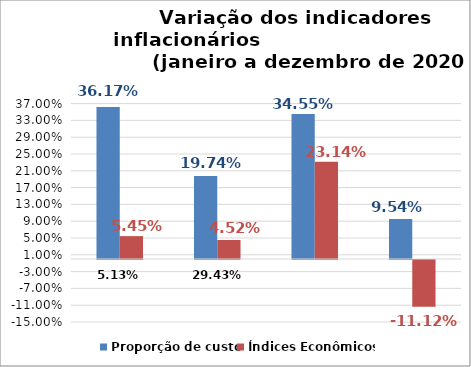
| Category | Proporção de custo | Índices Econômicos |
|---|---|---|
| 0.05126080989557842 | 0.362 | 0.054 |
| 0.29426763098570746 | 0.197 | 0.045 |